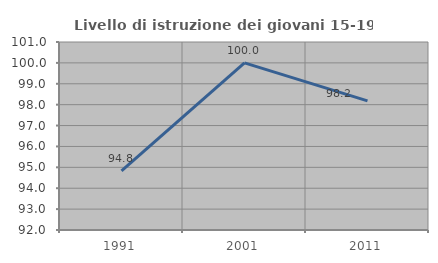
| Category | Livello di istruzione dei giovani 15-19 anni |
|---|---|
| 1991.0 | 94.828 |
| 2001.0 | 100 |
| 2011.0 | 98.182 |